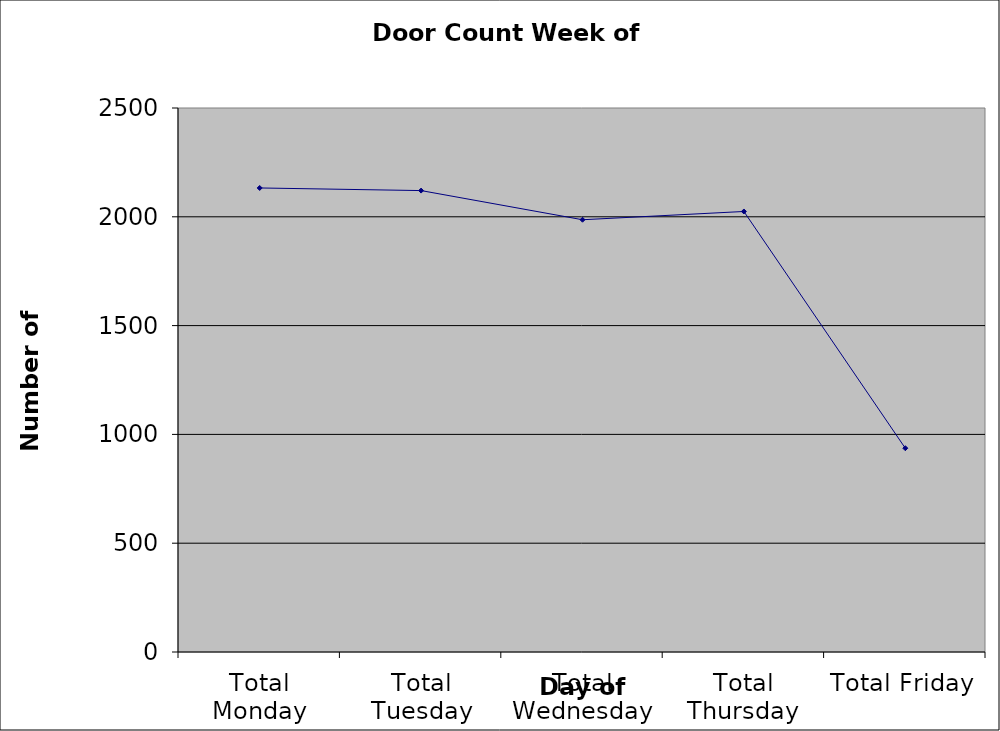
| Category | Series 0 |
|---|---|
| Total Monday | 2132.5 |
| Total Tuesday | 2120.5 |
| Total Wednesday | 1986.5 |
| Total Thursday | 2024.5 |
| Total Friday | 936.5 |